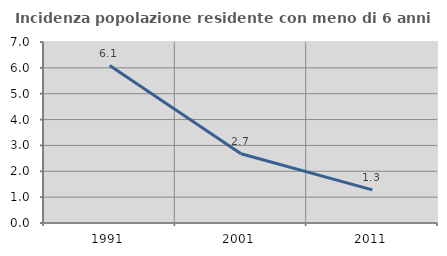
| Category | Incidenza popolazione residente con meno di 6 anni |
|---|---|
| 1991.0 | 6.087 |
| 2001.0 | 2.679 |
| 2011.0 | 1.282 |